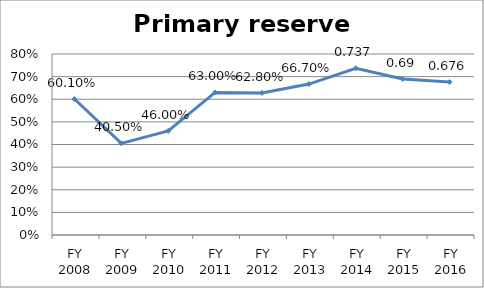
| Category | Primary reserve ratio |
|---|---|
| FY 2016 | 0.676 |
| FY 2015 | 0.69 |
| FY 2014 | 0.737 |
| FY 2013 | 0.667 |
| FY 2012 | 0.628 |
| FY 2011 | 0.63 |
| FY 2010 | 0.46 |
| FY 2009 | 0.405 |
| FY 2008 | 0.601 |